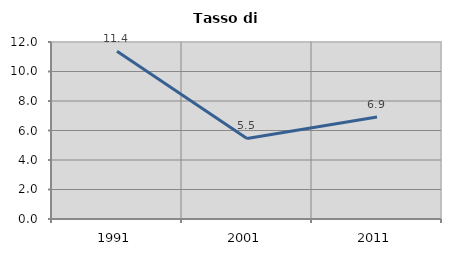
| Category | Tasso di disoccupazione   |
|---|---|
| 1991.0 | 11.37 |
| 2001.0 | 5.46 |
| 2011.0 | 6.919 |